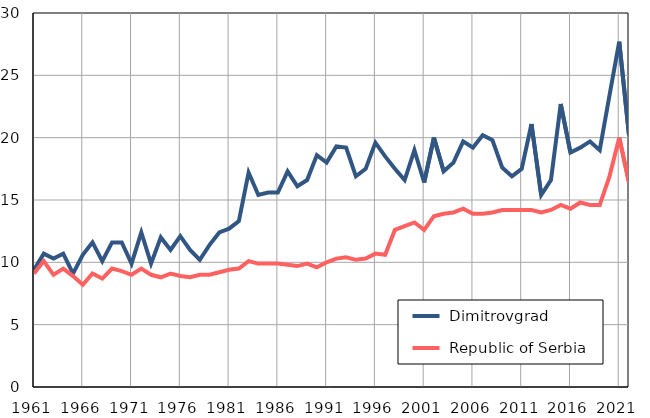
| Category |  Dimitrovgrad |  Republic of Serbia |
|---|---|---|
| 1961.0 | 9.4 | 9.1 |
| 1962.0 | 10.7 | 10.1 |
| 1963.0 | 10.3 | 9 |
| 1964.0 | 10.7 | 9.5 |
| 1965.0 | 9.1 | 8.9 |
| 1966.0 | 10.6 | 8.2 |
| 1967.0 | 11.6 | 9.1 |
| 1968.0 | 10.1 | 8.7 |
| 1969.0 | 11.6 | 9.5 |
| 1970.0 | 11.6 | 9.3 |
| 1971.0 | 9.9 | 9 |
| 1972.0 | 12.4 | 9.5 |
| 1973.0 | 9.9 | 9 |
| 1974.0 | 12 | 8.8 |
| 1975.0 | 11 | 9.1 |
| 1976.0 | 12.1 | 8.9 |
| 1977.0 | 11 | 8.8 |
| 1978.0 | 10.2 | 9 |
| 1979.0 | 11.4 | 9 |
| 1980.0 | 12.4 | 9.2 |
| 1981.0 | 12.7 | 9.4 |
| 1982.0 | 13.3 | 9.5 |
| 1983.0 | 17.2 | 10.1 |
| 1984.0 | 15.4 | 9.9 |
| 1985.0 | 15.6 | 9.9 |
| 1986.0 | 15.6 | 9.9 |
| 1987.0 | 17.3 | 9.8 |
| 1988.0 | 16.1 | 9.7 |
| 1989.0 | 16.6 | 9.9 |
| 1990.0 | 18.6 | 9.6 |
| 1991.0 | 18 | 10 |
| 1992.0 | 19.3 | 10.3 |
| 1993.0 | 19.2 | 10.4 |
| 1994.0 | 16.9 | 10.2 |
| 1995.0 | 17.5 | 10.3 |
| 1996.0 | 19.6 | 10.7 |
| 1997.0 | 18.5 | 10.6 |
| 1998.0 | 17.5 | 12.6 |
| 1999.0 | 16.6 | 12.9 |
| 2000.0 | 19 | 13.2 |
| 2001.0 | 16.4 | 12.6 |
| 2002.0 | 20 | 13.7 |
| 2003.0 | 17.3 | 13.9 |
| 2004.0 | 18 | 14 |
| 2005.0 | 19.7 | 14.3 |
| 2006.0 | 19.2 | 13.9 |
| 2007.0 | 20.2 | 13.9 |
| 2008.0 | 19.8 | 14 |
| 2009.0 | 17.6 | 14.2 |
| 2010.0 | 16.9 | 14.2 |
| 2011.0 | 17.5 | 14.2 |
| 2012.0 | 21.1 | 14.2 |
| 2013.0 | 15.4 | 14 |
| 2014.0 | 16.6 | 14.2 |
| 2015.0 | 22.7 | 14.6 |
| 2016.0 | 18.8 | 14.3 |
| 2017.0 | 19.2 | 14.8 |
| 2018.0 | 19.7 | 14.6 |
| 2019.0 | 19 | 14.6 |
| 2020.0 | 23.4 | 16.9 |
| 2021.0 | 27.7 | 20 |
| 2022.0 | 20.2 | 16.4 |